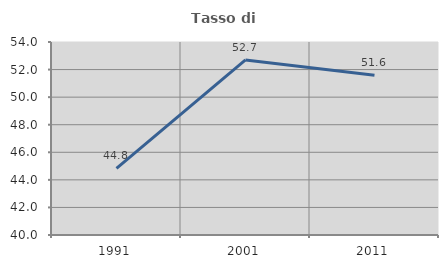
| Category | Tasso di occupazione   |
|---|---|
| 1991.0 | 44.84 |
| 2001.0 | 52.697 |
| 2011.0 | 51.59 |